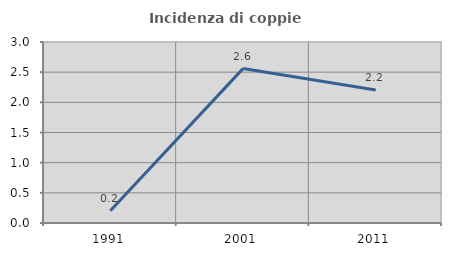
| Category | Incidenza di coppie miste |
|---|---|
| 1991.0 | 0.204 |
| 2001.0 | 2.559 |
| 2011.0 | 2.204 |